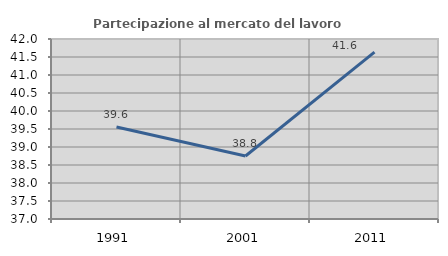
| Category | Partecipazione al mercato del lavoro  femminile |
|---|---|
| 1991.0 | 39.554 |
| 2001.0 | 38.75 |
| 2011.0 | 41.635 |